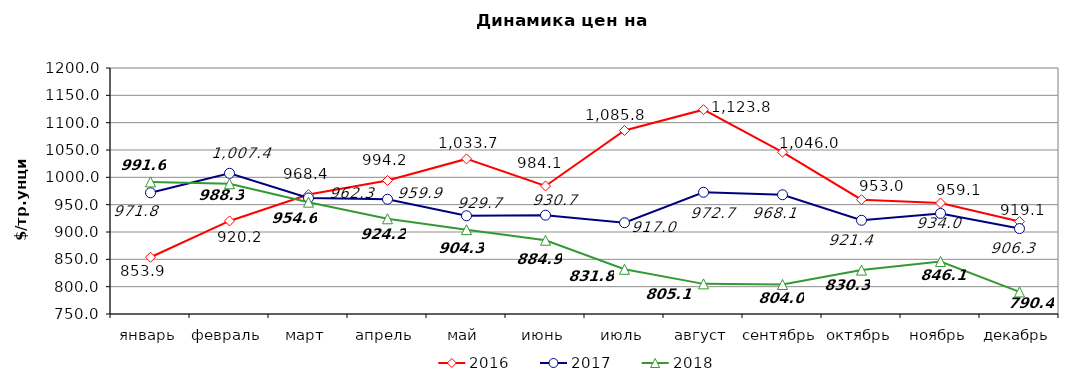
| Category | 2016 | 2017 | 2018 |
|---|---|---|---|
| январь | 853.85 | 971.76 | 991.6 |
| февраль | 920.24 | 1007.35 | 988.25 |
| март | 968.43 | 962.26 | 954.57 |
| апрель | 994.19 | 959.89 | 924.16 |
| май | 1033.7 | 929.71 | 904.29 |
| июнь | 984.14 | 930.73 | 884.9 |
| июль | 1085.76 | 916.95 | 831.84 |
| август | 1123.77 | 972.67 | 805.11 |
| сентябрь | 1045.95 | 968.1 | 803.98 |
| октябрь | 959.14 | 921.43 | 830.32 |
| ноябрь | 953 | 934 | 846.14 |
| декабрь | 919.05 | 906.32 | 790.35 |